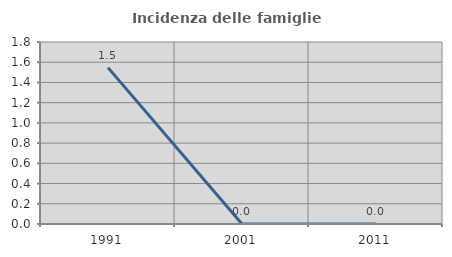
| Category | Incidenza delle famiglie numerose |
|---|---|
| 1991.0 | 1.546 |
| 2001.0 | 0 |
| 2011.0 | 0 |